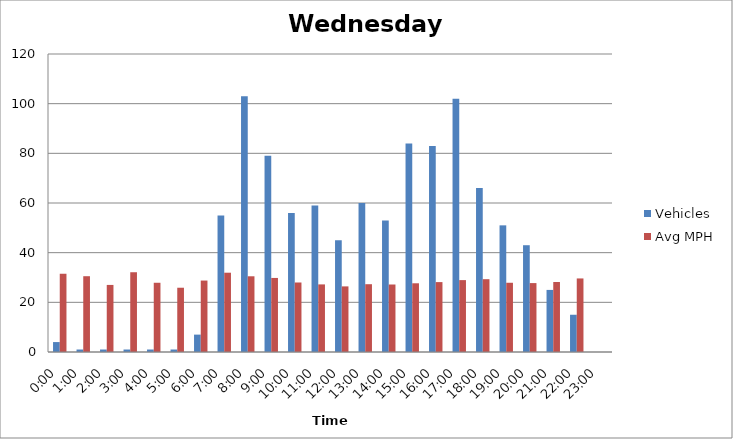
| Category | Vehicles | Avg MPH |
|---|---|---|
| 0:00 | 4 | 31.51 |
| 1:00 | 1 | 30.52 |
| 2:00 | 1 | 27.01 |
| 3:00 | 1 | 32.12 |
| 4:00 | 1 | 27.88 |
| 5:00 | 1 | 25.88 |
| 6:00 | 7 | 28.77 |
| 7:00 | 55 | 31.93 |
| 8:00 | 103 | 30.49 |
| 9:00 | 79 | 29.82 |
| 10:00 | 56 | 27.99 |
| 11:00 | 59 | 27.22 |
| 12:00 | 45 | 26.42 |
| 13:00 | 60 | 27.3 |
| 14:00 | 53 | 27.18 |
| 15:00 | 84 | 27.67 |
| 16:00 | 83 | 28.15 |
| 17:00 | 102 | 28.95 |
| 18:00 | 66 | 29.32 |
| 19:00 | 51 | 27.88 |
| 20:00 | 43 | 27.75 |
| 21:00 | 25 | 28.18 |
| 22:00 | 15 | 29.62 |
| 23:00 | 0 | 0 |